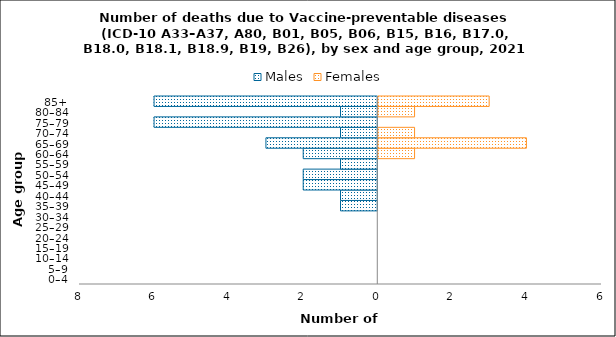
| Category | Males | Females |
|---|---|---|
| 0–4 | 0 | 0 |
| 5–9 | 0 | 0 |
| 10–14 | 0 | 0 |
| 15–19 | 0 | 0 |
| 20–24 | 0 | 0 |
| 25–29 | 0 | 0 |
| 30–34 | 0 | 0 |
| 35–39 | -1 | 0 |
| 40–44 | -1 | 0 |
| 45–49 | -2 | 0 |
| 50–54 | -2 | 0 |
| 55–59 | -1 | 0 |
| 60–64 | -2 | 1 |
| 65–69 | -3 | 4 |
| 70–74 | -1 | 1 |
| 75–79 | -6 | 0 |
| 80–84 | -1 | 1 |
| 85+ | -6 | 3 |